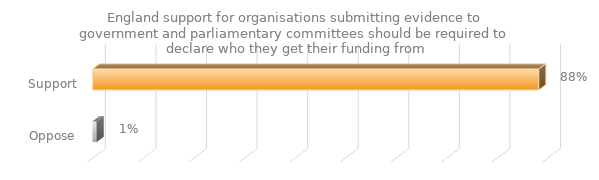
| Category | England support for organisations submitting evidence to government and parliamentary committees should be required to declare who they get their funding from |
|---|---|
| Support | 0.883 |
| Oppose | 0.008 |